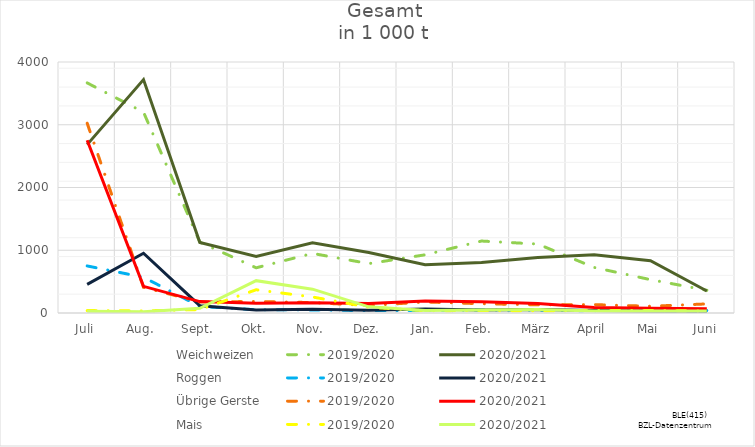
| Category | Weichweizen | 2019/2020 | 2020/2021 | Roggen | Übrige Gerste | Mais |
|---|---|---|---|---|---|---|
| Juli |  | 38.583 | 28.451 |  |  |  |
| Aug. |  | 33.504 | 19.53 |  |  |  |
| Sept. |  | 54.793 | 75.654 |  |  |  |
| Okt. |  | 370.392 | 515.587 |  |  |  |
| Nov. |  | 255.301 | 379.979 |  |  |  |
| Dez. |  | 92.52 | 98.06 |  |  |  |
| Jan. |  | 35.883 | 40.181 |  |  |  |
| Feb. |  | 40.083 | 47.069 |  |  |  |
| März |  | 35.668 | 57.347 |  |  |  |
| April |  | 38.945 | 33.736 |  |  |  |
| Mai |  | 38.527 | 32.204 |  |  |  |
| Juni |  | 32.295 | 30.103 |  |  |  |